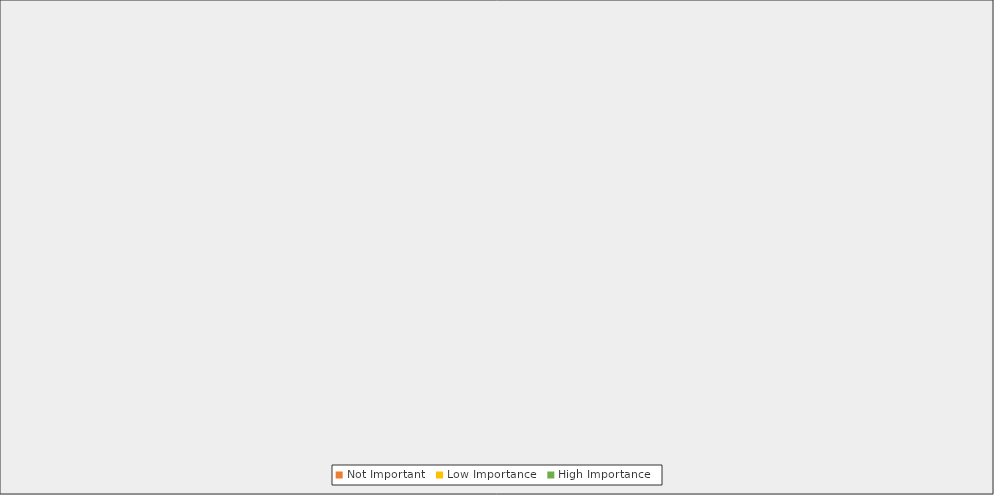
| Category | Not Important | Low Importance | High Importance |
|---|---|---|---|
| A means to connect identity professionals for networking and information sharing | 1 | 25 | 110 |
| Professional career development tools such as salary surveys and market demand surveys | 30 | 73 | 32 |
| Job postings, consulting opportunities, career path advice | 16 | 74 | 45 |
| Advocacy to decision makers and leaders on important subjects of importance to the identity professionals community | 2 | 9 | 124 |
| For-fee training, conferences and summits | 14 | 73 | 48 |
| A library of expert research articles, publications, frameworks, tools and methodologies to increase professional’s capabilities, knowledge and skills | 2 | 26 | 108 |
| A standard body of knowledge | 3 | 25 | 107 |
| A Code of Practice for digital identity professionals | 6 | 27 | 103 |
| Contribution to national and international standards development organizations for digital identity | 2 | 16 | 118 |
| A Professional Certification Program to demonstrate your competence | 9 | 61 | 66 |